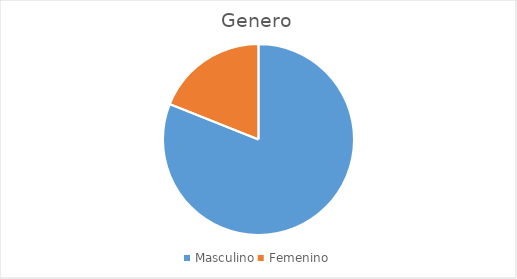
| Category | Series 0 |
|---|---|
| Masculino | 94 |
| Femenino | 22 |